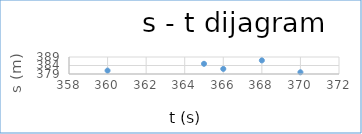
| Category | s (m) |
|---|---|
| 360.0 | 381 |
| 366.0 | 382 |
| 365.0 | 385 |
| 370.0 | 380 |
| 368.0 | 387 |